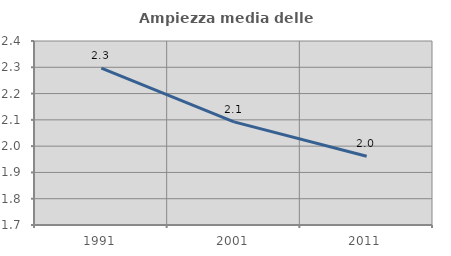
| Category | Ampiezza media delle famiglie |
|---|---|
| 1991.0 | 2.297 |
| 2001.0 | 2.092 |
| 2011.0 | 1.962 |